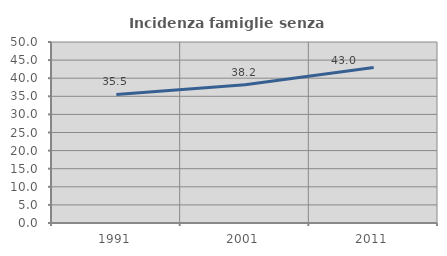
| Category | Incidenza famiglie senza nuclei |
|---|---|
| 1991.0 | 35.528 |
| 2001.0 | 38.166 |
| 2011.0 | 42.951 |